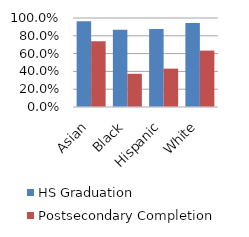
| Category | HS Graduation | Postsecondary Completion |
|---|---|---|
| Asian | 0.963 | 0.74 |
| Black | 0.868 | 0.373 |
| Hispanic | 0.876 | 0.431 |
| White | 0.944 | 0.634 |